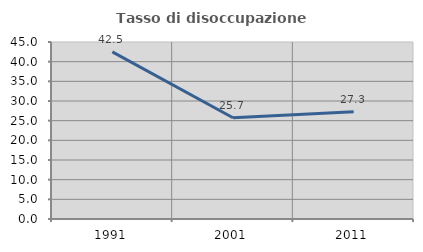
| Category | Tasso di disoccupazione giovanile  |
|---|---|
| 1991.0 | 42.491 |
| 2001.0 | 25.727 |
| 2011.0 | 27.273 |